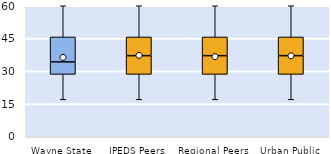
| Category | 25th | 50th | 75th |
|---|---|---|---|
| Wayne State | 28.571 | 5.714 | 11.429 |
| IPEDS Peers | 28.571 | 8.571 | 8.571 |
| Regional Peers | 28.571 | 8.571 | 8.571 |
| Urban Public | 28.571 | 8.571 | 8.571 |